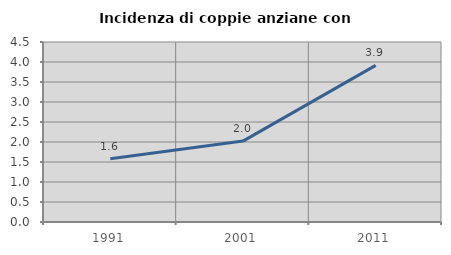
| Category | Incidenza di coppie anziane con figli |
|---|---|
| 1991.0 | 1.579 |
| 2001.0 | 2.023 |
| 2011.0 | 3.915 |